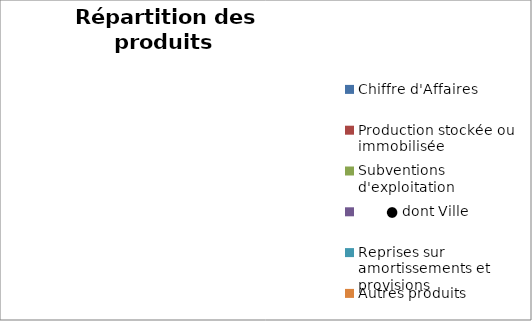
| Category | 2022 |
|---|---|
| Chiffre d'Affaires | 0 |
| Production stockée ou immobilisée | 0 |
| Subventions d'exploitation | 0 |
|        ● dont Ville | 0 |
| Reprises sur amortissements et provisions | 0 |
| Autres produits | 0 |
| Transferts de charges | 0 |